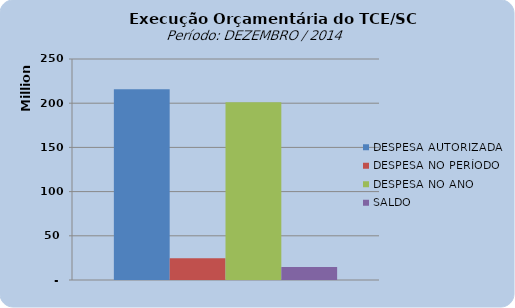
| Category | DESPESA AUTORIZADA | DESPESA NO PERÍODO | DESPESA NO ANO | SALDO |
|---|---|---|---|---|
| 0 | 215640994.51 | 24734192.43 | 201070960.64 | 14570033.87 |